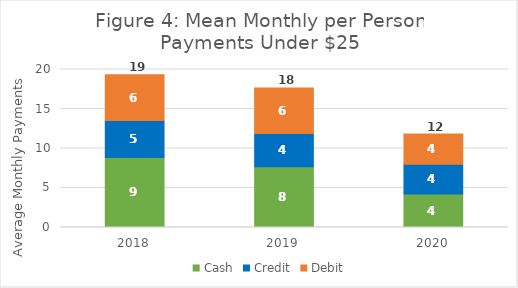
| Category | Cash | Credit | Debit | Total |
|---|---|---|---|---|
| 2018.0 | 8.87 | 4.68 | 5.79 | 19.34 |
| 2019.0 | 7.7 | 4.2 | 5.76 | 17.66 |
| 2020.0 | 4.235 | 3.775 | 3.81 | 11.82 |